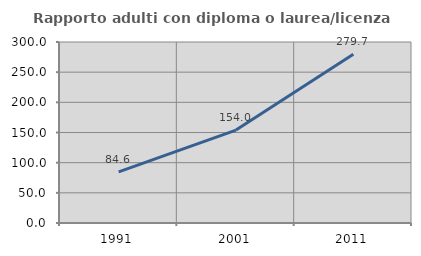
| Category | Rapporto adulti con diploma o laurea/licenza media  |
|---|---|
| 1991.0 | 84.615 |
| 2001.0 | 154.023 |
| 2011.0 | 279.71 |